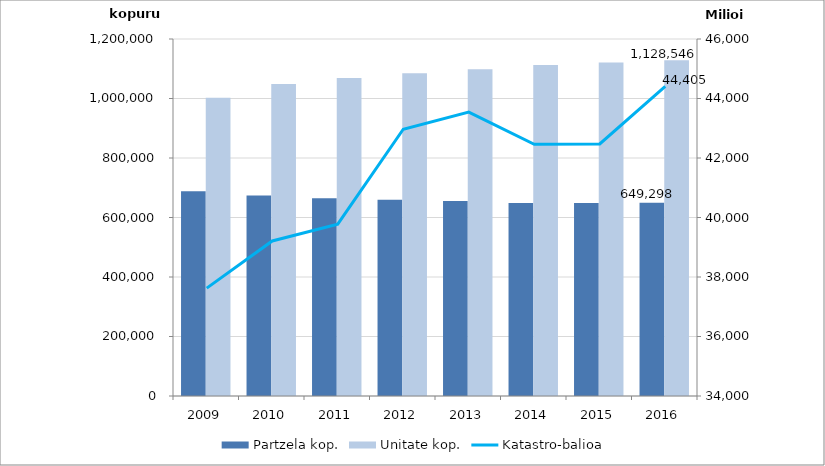
| Category | Partzela kop. | Unitate kop. |
|---|---|---|
| 2009.0 | 688282 | 1002438 |
| 2010.0 | 674358 | 1049029 |
| 2011.0 | 664963 | 1068556 |
| 2012.0 | 659476 | 1084868 |
| 2013.0 | 655509 | 1098151 |
| 2014.0 | 648587 | 1112891 |
| 2015.0 | 649060 | 1121255 |
| 2016.0 | 649298 | 1128546 |